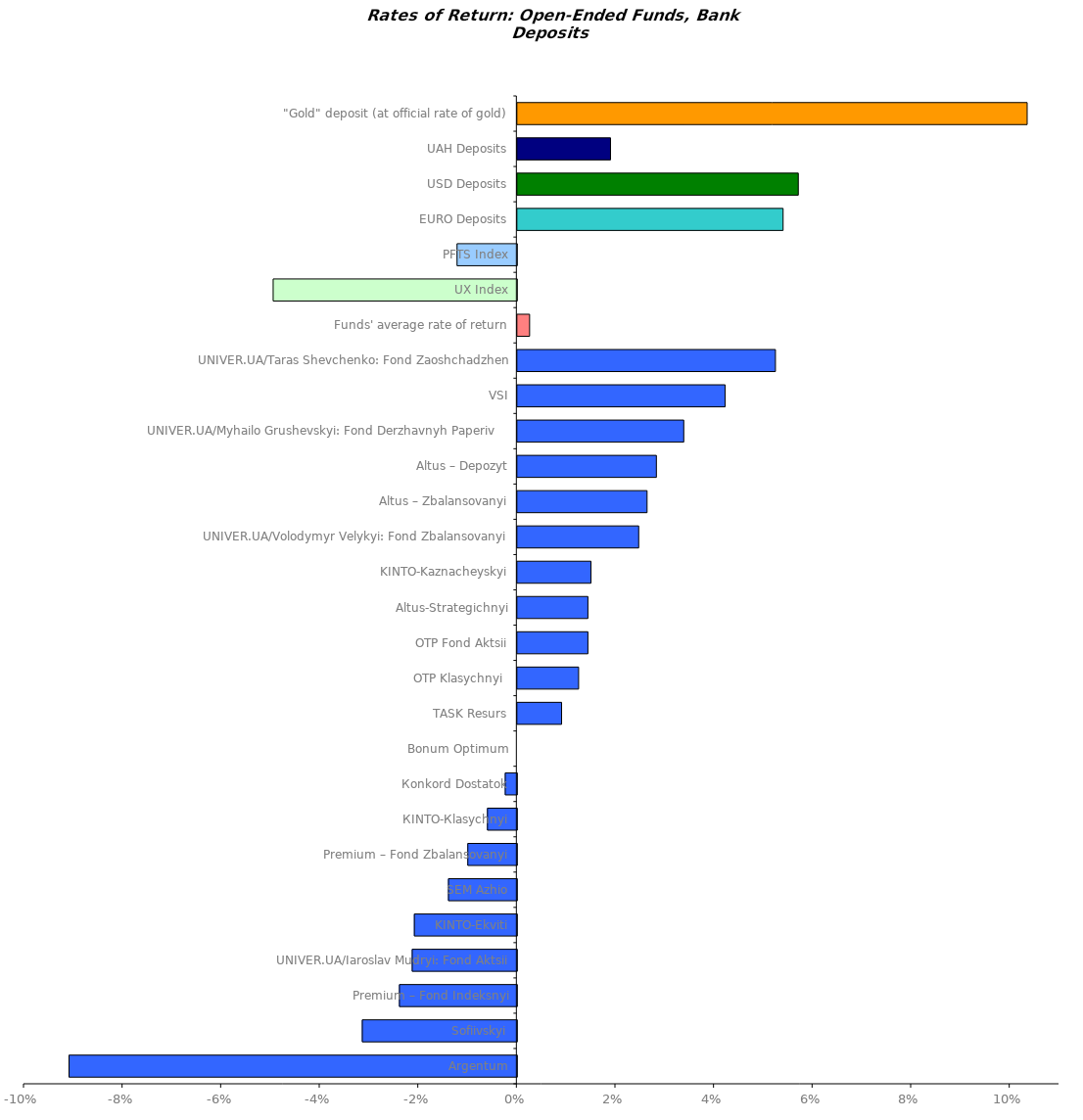
| Category | Series 0 |
|---|---|
| Argentum | -0.091 |
| Sofiivskyi | -0.031 |
| Premium – Fond Indeksnyi | -0.024 |
| UNIVER.UA/Iaroslav Mudryi: Fond Aktsii | -0.021 |
| KINTO-Ekviti | -0.021 |
| SEM Azhio | -0.014 |
| Premium – Fond Zbalansovanyi | -0.01 |
| КІNTO-Кlasychnyi | -0.006 |
| Коnkord Dostatok | -0.002 |
| Bonum Optimum | 0 |
| TASK Resurs | 0.009 |
| OTP Klasychnyi  | 0.012 |
| OTP Fond Aktsii | 0.014 |
| Altus-Strategichnyi | 0.014 |
| KINTO-Kaznacheyskyi | 0.015 |
| UNIVER.UA/Volodymyr Velykyi: Fond Zbalansovanyi | 0.025 |
| Altus – Zbalansovanyi | 0.026 |
| Altus – Depozyt | 0.028 |
| UNIVER.UA/Myhailo Grushevskyi: Fond Derzhavnyh Paperiv    | 0.034 |
| VSI | 0.042 |
| UNIVER.UA/Taras Shevchenko: Fond Zaoshchadzhen | 0.052 |
| Funds' average rate of return | 0.002 |
| UX Index | -0.049 |
| PFTS Index | -0.012 |
| EURO Deposits | 0.054 |
| USD Deposits | 0.057 |
| UAH Deposits | 0.019 |
| "Gold" deposit (at official rate of gold) | 0.103 |